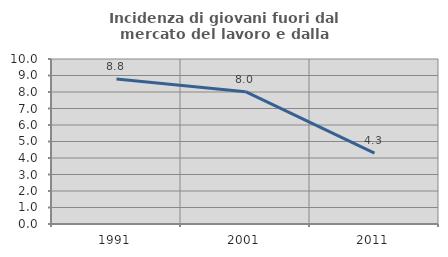
| Category | Incidenza di giovani fuori dal mercato del lavoro e dalla formazione  |
|---|---|
| 1991.0 | 8.781 |
| 2001.0 | 8.018 |
| 2011.0 | 4.296 |